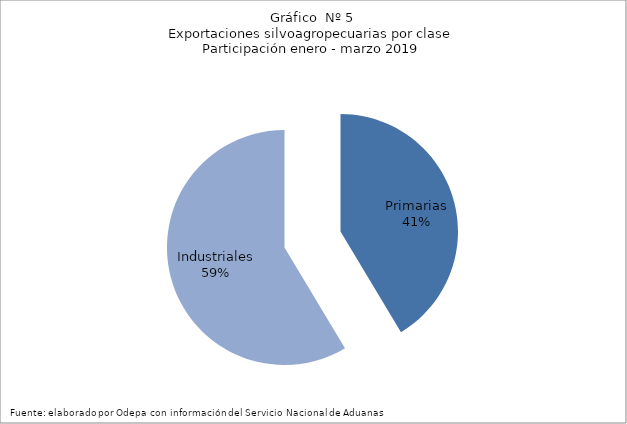
| Category | Series 0 |
|---|---|
| Primarias | 6917526 |
| Industriales | 9795368 |